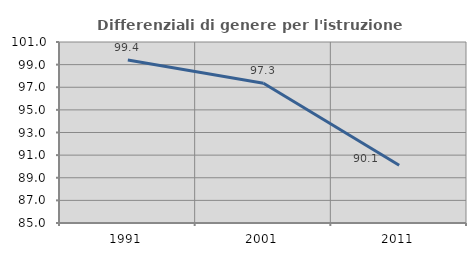
| Category | Differenziali di genere per l'istruzione superiore |
|---|---|
| 1991.0 | 99.402 |
| 2001.0 | 97.349 |
| 2011.0 | 90.108 |